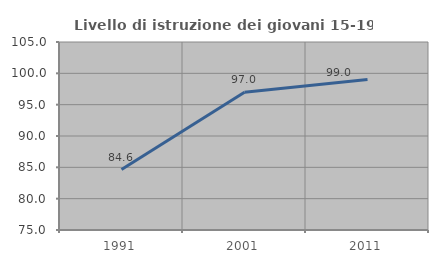
| Category | Livello di istruzione dei giovani 15-19 anni |
|---|---|
| 1991.0 | 84.639 |
| 2001.0 | 96.995 |
| 2011.0 | 99.001 |